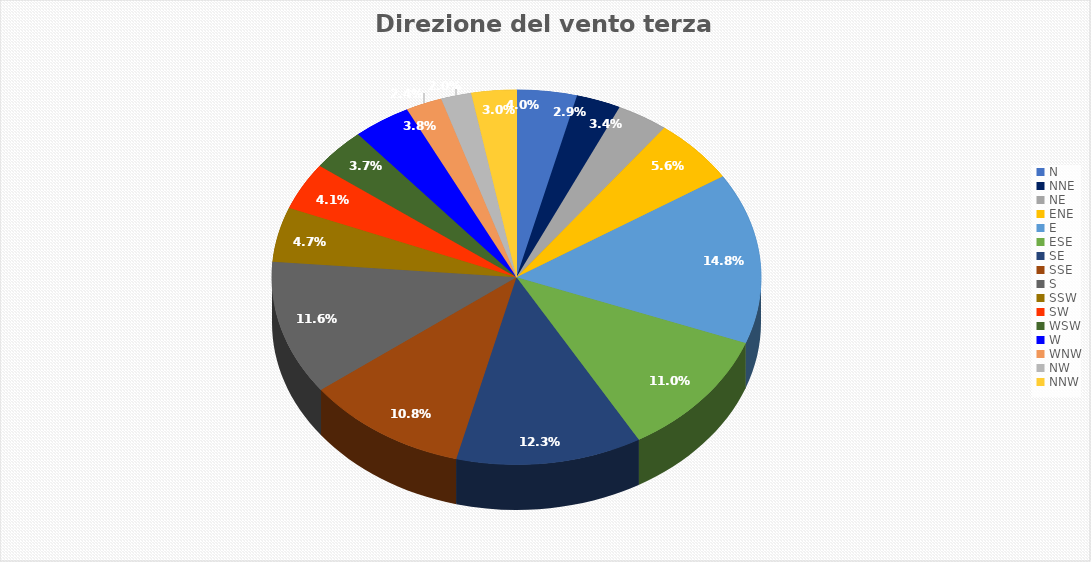
| Category | Percentuale |
|---|---|
| N | 3.978 |
| NNE | 2.935 |
| NE | 3.399 |
| ENE | 5.639 |
| E | 14.755 |
| ESE | 10.969 |
| SE | 12.283 |
| SSE | 10.776 |
| S | 11.587 |
| SSW | 4.712 |
| SW | 4.094 |
| WSW | 3.669 |
| W | 3.824 |
| WNW | 2.395 |
| NW | 2.008 |
| NNW | 2.974 |